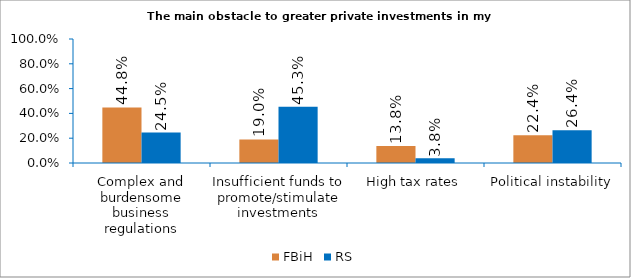
| Category | FBiH | RS |
|---|---|---|
| Complex and burdensome business regulations | 0.448 | 0.245 |
| Insufficient funds to promote/stimulate investments | 0.19 | 0.453 |
| High tax rates | 0.138 | 0.038 |
| Political instability | 0.224 | 0.264 |